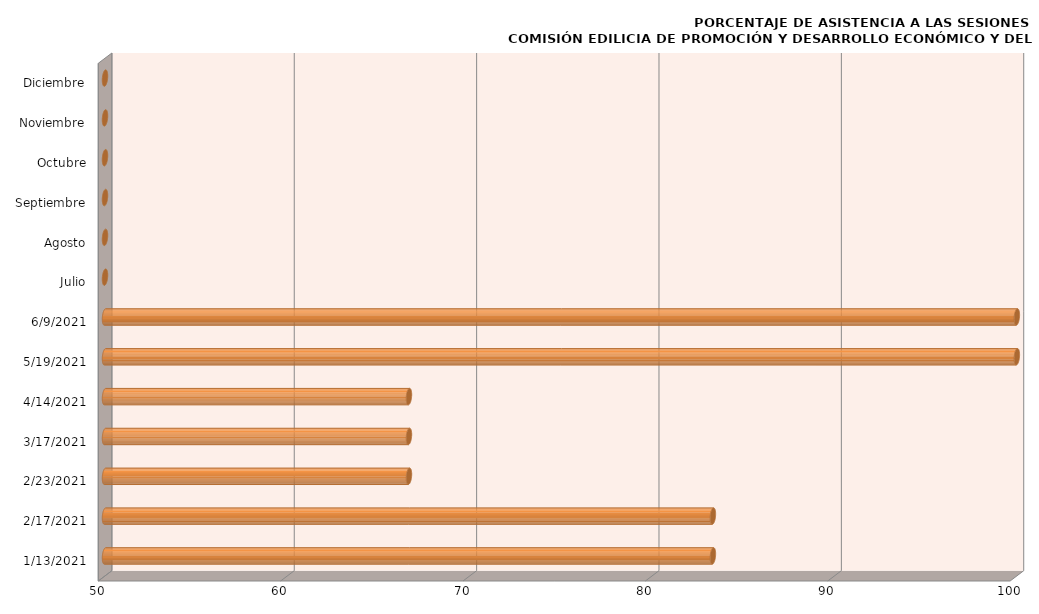
| Category | Series 0 |
|---|---|
| 13/01/2021 | 83.333 |
| 17/02/2021 | 83.333 |
| 23/02/2021 | 66.667 |
| 17/03/2021 | 66.667 |
| 14/04/2021 | 66.667 |
| 19/05/2021 | 100 |
| 09/06/2021 | 100 |
| Julio | 0 |
| Agosto | 0 |
| Septiembre | 0 |
| Octubre | 0 |
| Noviembre | 0 |
| Diciembre | 0 |